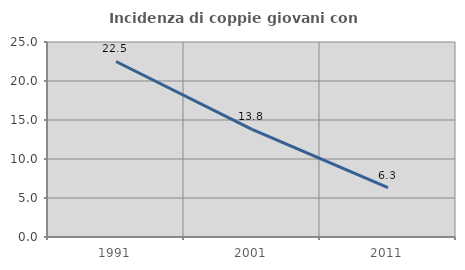
| Category | Incidenza di coppie giovani con figli |
|---|---|
| 1991.0 | 22.504 |
| 2001.0 | 13.798 |
| 2011.0 | 6.32 |